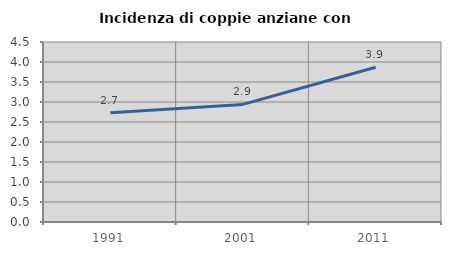
| Category | Incidenza di coppie anziane con figli |
|---|---|
| 1991.0 | 2.734 |
| 2001.0 | 2.94 |
| 2011.0 | 3.867 |